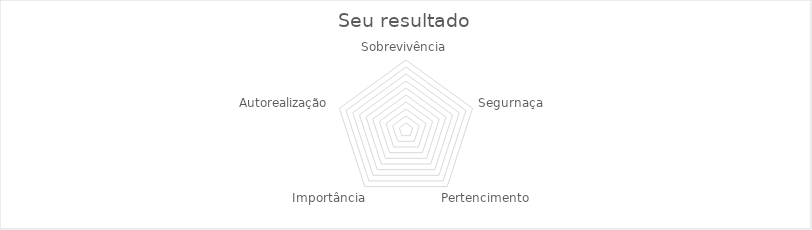
| Category | Series 0 |
|---|---|
| Sobrevivência | 0 |
| Segurnaça | 0 |
| Pertencimento | 0 |
| Importância | 0 |
| Autorealização | 0 |